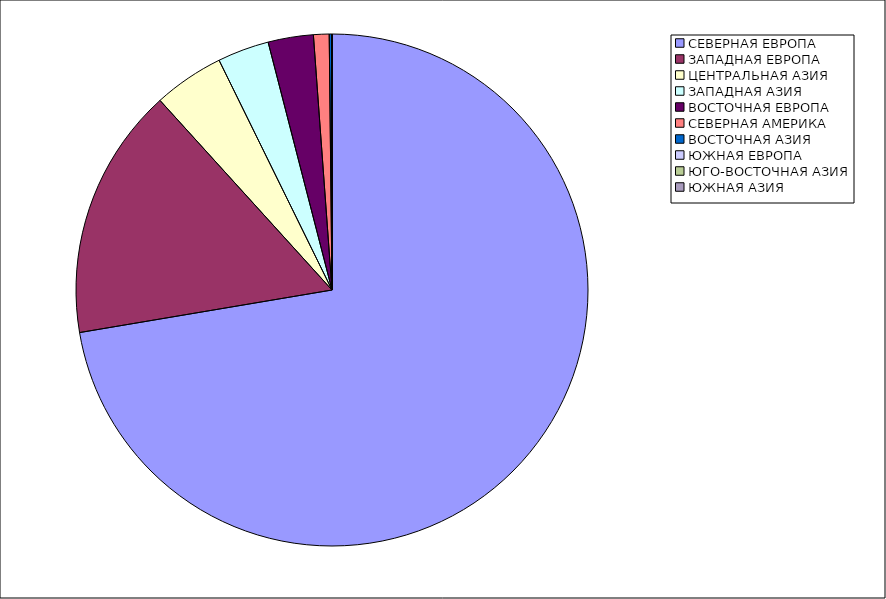
| Category | Оборот |
|---|---|
| СЕВЕРНАЯ ЕВРОПА | 72.34 |
| ЗАПАДНАЯ ЕВРОПА | 15.935 |
| ЦЕНТРАЛЬНАЯ АЗИЯ | 4.455 |
| ЗАПАДНАЯ АЗИЯ | 3.256 |
| ВОСТОЧНАЯ ЕВРОПА | 2.856 |
| СЕВЕРНАЯ АМЕРИКА | 0.986 |
| ВОСТОЧНАЯ АЗИЯ | 0.171 |
| ЮЖНАЯ ЕВРОПА | 0.002 |
| ЮГО-ВОСТОЧНАЯ АЗИЯ | 0 |
| ЮЖНАЯ АЗИЯ | 0 |